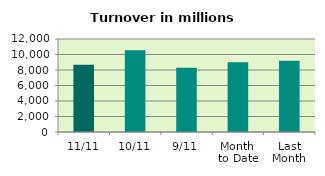
| Category | Series 0 |
|---|---|
| 11/11 | 8670.854 |
| 10/11 | 10538.76 |
| 9/11 | 8302.016 |
| Month 
to Date | 9008.825 |
| Last
Month | 9192.028 |